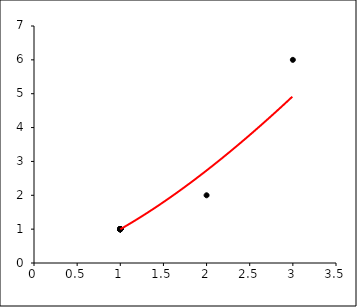
| Category | Series 0 |
|---|---|
| 1.0 | 1 |
| 2.0 | 2 |
| 3.0 | 6 |
| 1.0 | 1 |
| 1.0 | 1 |
| 1.0 | 1 |
| 1.0 | 1 |
| 1.0 | 1 |
| 1.0 | 1 |
| 1.0 | 1 |
| 1.0 | 1 |
| 1.0 | 1 |
| 1.0 | 1 |
| 1.0 | 1 |
| 1.0 | 1 |
| 1.0 | 1 |
| 1.0 | 1 |
| 1.0 | 1 |
| 1.0 | 1 |
| 1.0 | 1 |
| 1.0 | 1 |
| 1.0 | 1 |
| 1.0 | 1 |
| 1.0 | 1 |
| 1.0 | 1 |
| 1.0 | 1 |
| 1.0 | 1 |
| 1.0 | 1 |
| 1.0 | 1 |
| 1.0 | 1 |
| 1.0 | 1 |
| 1.0 | 1 |
| 1.0 | 1 |
| 1.0 | 1 |
| 1.0 | 1 |
| 1.0 | 1 |
| 1.0 | 1 |
| 1.0 | 1 |
| 1.0 | 1 |
| 1.0 | 1 |
| 1.0 | 1 |
| 1.0 | 1 |
| 1.0 | 1 |
| 1.0 | 1 |
| 1.0 | 1 |
| 1.0 | 1 |
| 1.0 | 1 |
| 1.0 | 1 |
| 1.0 | 1 |
| 1.0 | 1 |